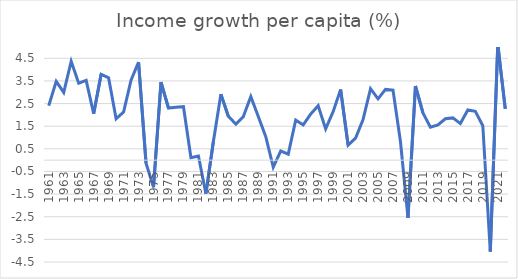
| Category | Growth per capita growth (%) |
|---|---|
| 1961 | 2.407 |
| 1962 | 3.482 |
| 1963 | 2.992 |
| 1964 | 4.368 |
| 1965 | 3.4 |
| 1966 | 3.527 |
| 1967 | 2.054 |
| 1968 | 3.793 |
| 1969 | 3.637 |
| 1970 | 1.83 |
| 1971 | 2.126 |
| 1972 | 3.537 |
| 1973 | 4.333 |
| 1974 | -0.136 |
| 1975 | -1.198 |
| 1976 | 3.447 |
| 1977 | 2.304 |
| 1978 | 2.341 |
| 1979 | 2.364 |
| 1980 | 0.112 |
| 1981 | 0.18 |
| 1982 | -1.479 |
| 1983 | 0.825 |
| 1984 | 2.914 |
| 1985 | 1.936 |
| 1986 | 1.595 |
| 1987 | 1.925 |
| 1988 | 2.81 |
| 1989 | 1.928 |
| 1990 | 1.036 |
| 1991 | -0.309 |
| 1992 | 0.406 |
| 1993 | 0.264 |
| 1994 | 1.77 |
| 1995 | 1.557 |
| 1996 | 2.036 |
| 1997 | 2.406 |
| 1998 | 1.381 |
| 1999 | 2.143 |
| 2000 | 3.12 |
| 2001 | 0.666 |
| 2002 | 0.978 |
| 2003 | 1.799 |
| 2004 | 3.156 |
| 2005 | 2.707 |
| 2006 | 3.125 |
| 2007 | 3.095 |
| 2008 | 0.812 |
| 2009 | -2.547 |
| 2010 | 3.278 |
| 2011 | 2.09 |
| 2012 | 1.452 |
| 2013 | 1.554 |
| 2014 | 1.831 |
| 2015 | 1.868 |
| 2016 | 1.616 |
| 2017 | 2.216 |
| 2018 | 2.162 |
| 2019 | 1.523 |
| 2020 | -4.042 |
| 2021 | 5.121 |